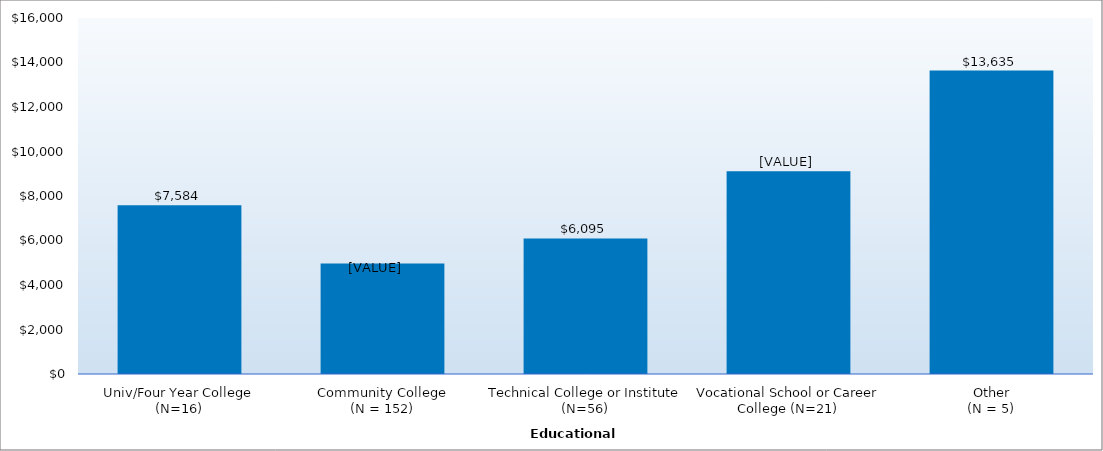
| Category | Series 0 |
|---|---|
| Univ/Four Year College (N=16) | 7584 |
| Community College
(N = 152) | 4971 |
| Technical College or Institute (N=56) | 6095 |
| Vocational School or Career College (N=21) | 9109 |
| Other
(N = 5) | 13635 |